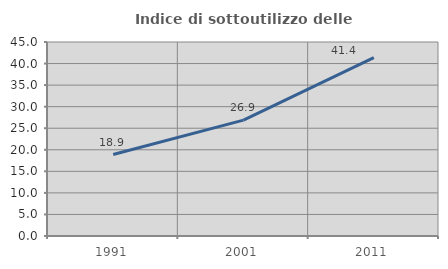
| Category | Indice di sottoutilizzo delle abitazioni  |
|---|---|
| 1991.0 | 18.891 |
| 2001.0 | 26.882 |
| 2011.0 | 41.391 |